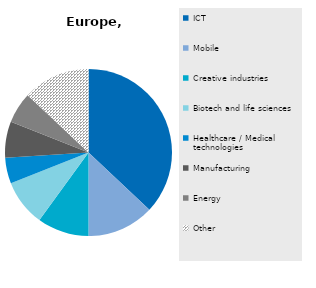
| Category | Series 0 |
|---|---|
| ICT | 37 |
| Mobile | 13 |
| Creative industries | 10 |
| Biotech and life sciences | 9 |
| Healthcare / Medical technologies | 5 |
| Manufacturing | 7 |
| Energy  | 6 |
| Other | 13 |